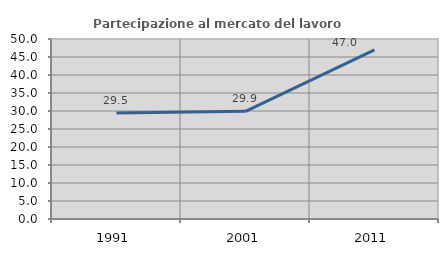
| Category | Partecipazione al mercato del lavoro  femminile |
|---|---|
| 1991.0 | 29.464 |
| 2001.0 | 29.897 |
| 2011.0 | 46.988 |